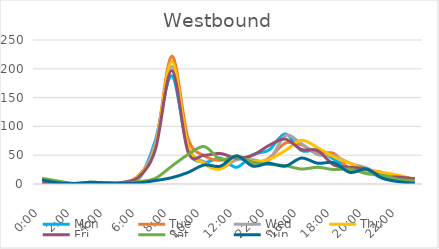
| Category | Mon | Tue | Wed | Thu | Fri | Sat | Sun |
|---|---|---|---|---|---|---|---|
| 0.0 | 1 | 0 | 1 | 1 | 1 | 10 | 7 |
| 0.041667 | 3 | 0 | 0 | 0 | 2 | 5 | 2 |
| 0.083333 | 0 | 0 | 1 | 0 | 0 | 1 | 1 |
| 0.125 | 0 | 0 | 0 | 1 | 0 | 3 | 3 |
| 0.166667 | 2 | 1 | 1 | 0 | 0 | 0 | 2 |
| 0.208333 | 2 | 2 | 2 | 2 | 3 | 1 | 1 |
| 0.25 | 10 | 16 | 10 | 15 | 13 | 4 | 2 |
| 0.291667 | 77 | 68 | 72 | 65 | 61 | 10 | 6 |
| 0.333333 | 188 | 222 | 204 | 213 | 197 | 31 | 11 |
| 0.375 | 60 | 80 | 67 | 67 | 56 | 51 | 20 |
| 0.416667 | 38 | 49 | 38 | 35 | 50 | 65 | 33 |
| 0.458333 | 45 | 41 | 27 | 26 | 53 | 43 | 31 |
| 0.5 | 29 | 47 | 42 | 48 | 45 | 47 | 49 |
| 0.541667 | 51 | 36 | 42 | 39 | 50 | 38 | 31 |
| 1900-01-02 22:00:00 | 59 | 45 | 41 | 43 | 67 | 34 | 36 |
| 0.625 | 87 | 71 | 84 | 58 | 78 | 32 | 31 |
| 0.666667 | 58 | 68 | 70 | 76 | 60 | 26 | 45 |
| 0.708333 | 59 | 53 | 51 | 63 | 58 | 29 | 36 |
| 0.75 | 43 | 53 | 49 | 47 | 33 | 25 | 37 |
| 0.791667 | 27 | 25 | 36 | 36 | 29 | 26 | 20 |
| 0.833333 | 24 | 24 | 28 | 24 | 26 | 18 | 26 |
| 0.875 | 10 | 20 | 16 | 20 | 13 | 15 | 10 |
| 0.916667 | 9 | 7 | 12 | 15 | 12 | 8 | 4 |
| 0.958333 | 7 | 3 | 2 | 8 | 9 | 6 | 1 |